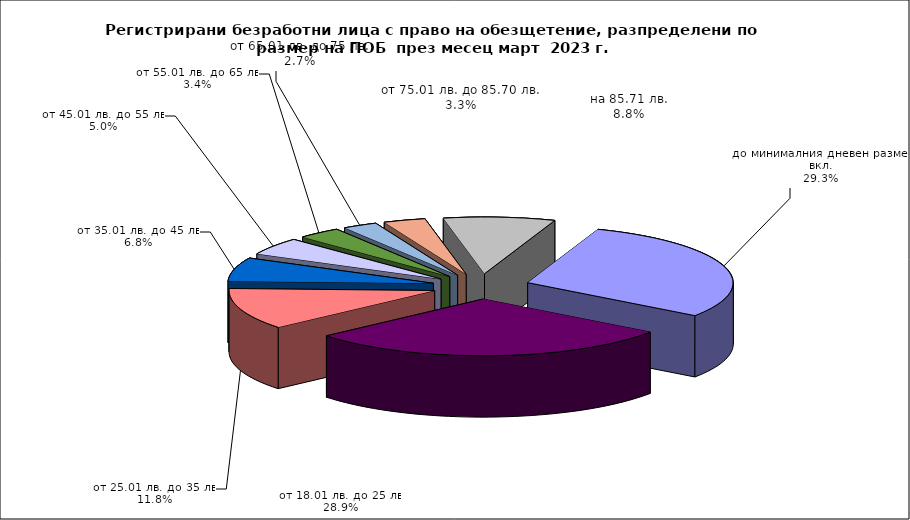
| Category | Series 0 |
|---|---|
| до минималния дневен размер вкл. | 0.293 |
| от 18.01 лв. до 25 лв. | 0.289 |
| от 25.01 лв. до 35 лв. | 0.118 |
| от 35.01 лв. до 45 лв. | 0.068 |
| от 45.01 лв. до 55 лв. | 0.05 |
| от 55.01 лв. до 65 лв. | 0.034 |
| от 65.01 лв. до 75 лв. | 0.027 |
| от 75.01 лв. до 85.70 лв. | 0.033 |
| на 85.71 лв. | 0.088 |